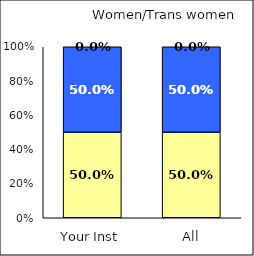
| Category | Low Science Self-Efficacy | Average Science Self-Efficacy | High Science Self-Efficacy |
|---|---|---|---|
| Your Inst | 0.5 | 0.5 | 0 |
| All | 0.5 | 0.5 | 0 |